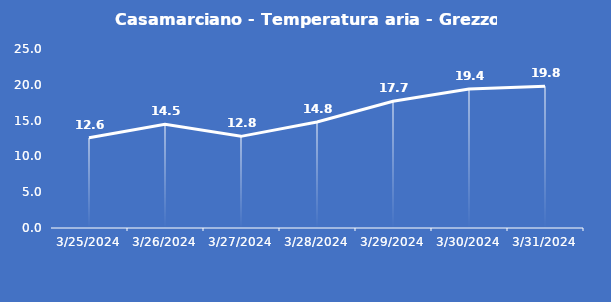
| Category | Casamarciano - Temperatura aria - Grezzo (°C) |
|---|---|
| 3/25/24 | 12.6 |
| 3/26/24 | 14.5 |
| 3/27/24 | 12.8 |
| 3/28/24 | 14.8 |
| 3/29/24 | 17.7 |
| 3/30/24 | 19.4 |
| 3/31/24 | 19.8 |